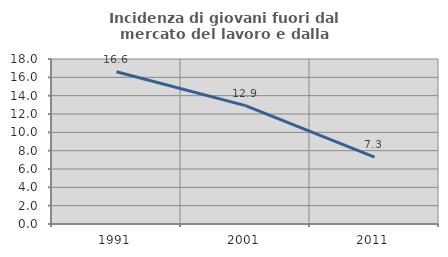
| Category | Incidenza di giovani fuori dal mercato del lavoro e dalla formazione  |
|---|---|
| 1991.0 | 16.608 |
| 2001.0 | 12.919 |
| 2011.0 | 7.292 |